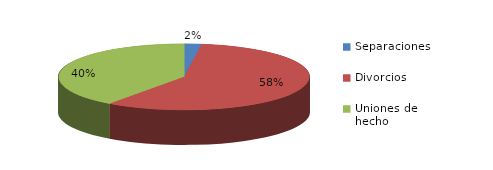
| Category | Series 0 |
|---|---|
| Separaciones | 279 |
| Divorcios | 7250 |
| Uniones de hecho | 5016 |